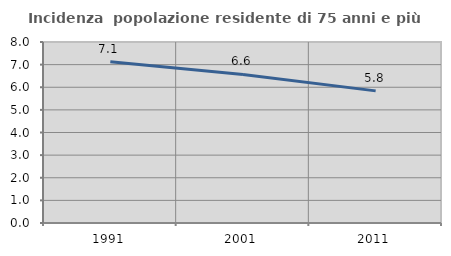
| Category | Incidenza  popolazione residente di 75 anni e più |
|---|---|
| 1991.0 | 7.126 |
| 2001.0 | 6.565 |
| 2011.0 | 5.84 |